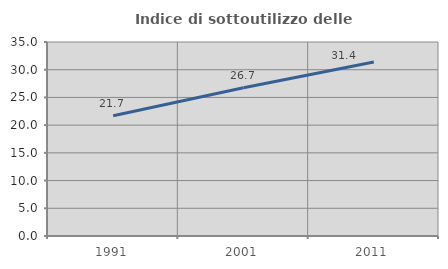
| Category | Indice di sottoutilizzo delle abitazioni  |
|---|---|
| 1991.0 | 21.685 |
| 2001.0 | 26.738 |
| 2011.0 | 31.389 |